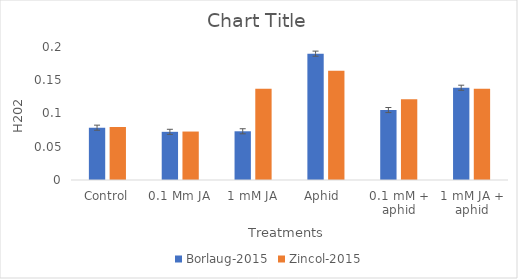
| Category | Borlaug-2015 | Zincol-2015 |
|---|---|---|
| Control | 0.079 | 0.08 |
| 0.1 Mm JA | 0.072 | 0.073 |
| 1 mM JA | 0.073 | 0.137 |
| Aphid  | 0.19 | 0.164 |
| 0.1 mM + aphid | 0.105 | 0.122 |
| 1 mM JA + aphid | 0.139 | 0.137 |